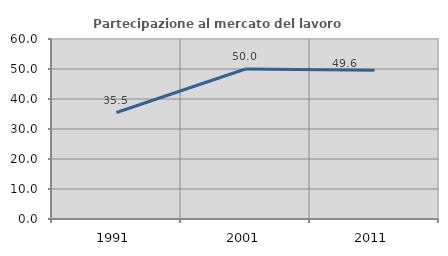
| Category | Partecipazione al mercato del lavoro  femminile |
|---|---|
| 1991.0 | 35.49 |
| 2001.0 | 50 |
| 2011.0 | 49.616 |